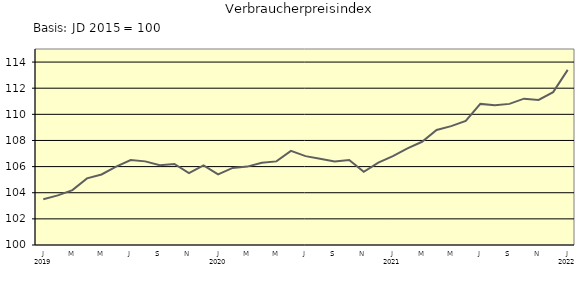
| Category | Series 0 |
|---|---|
| 0 | 103.5 |
| 1 | 103.8 |
| 2 | 104.2 |
| 3 | 105.1 |
| 4 | 105.4 |
| 5 | 106 |
| 6 | 106.5 |
| 7 | 106.4 |
| 8 | 106.1 |
| 9 | 106.2 |
| 10 | 105.5 |
| 11 | 106.1 |
| 12 | 105.4 |
| 13 | 105.9 |
| 14 | 106 |
| 15 | 106.3 |
| 16 | 106.4 |
| 17 | 107.2 |
| 18 | 106.8 |
| 19 | 106.6 |
| 20 | 106.4 |
| 21 | 106.5 |
| 22 | 105.6 |
| 23 | 106.3 |
| 24 | 106.8 |
| 25 | 107.4 |
| 26 | 107.9 |
| 27 | 108.8 |
| 28 | 109.1 |
| 29 | 109.5 |
| 30 | 110.8 |
| 31 | 110.7 |
| 32 | 110.8 |
| 33 | 111.2 |
| 34 | 111.1 |
| 35 | 111.7 |
| 36 | 113.4 |